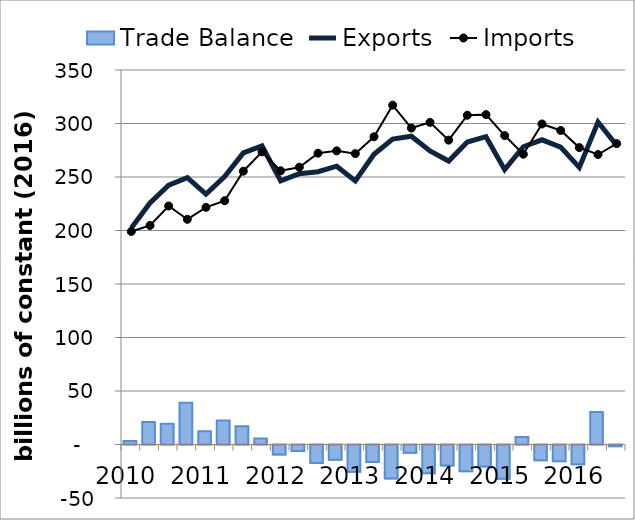
| Category | Trade Balance |
|---|---|
| 2010.0 | 3.347 |
| nan | 20.949 |
| nan | 19.5 |
| nan | 38.964 |
| 2011.0 | 12.385 |
| nan | 22.46 |
| nan | 17.107 |
| nan | 5.533 |
| 2012.0 | -9.362 |
| nan | -6.075 |
| nan | -17.274 |
| nan | -14.33 |
| 2013.0 | -25.552 |
| nan | -16.385 |
| nan | -31.711 |
| nan | -7.653 |
| 2014.0 | -26.767 |
| nan | -19.518 |
| nan | -24.988 |
| nan | -20.64 |
| 2015.0 | -31.903 |
| nan | 6.961 |
| nan | -14.79 |
| nan | -15.543 |
| 2016.0 | -18.49 |
| nan | 30.377 |
| nan | -1.598 |